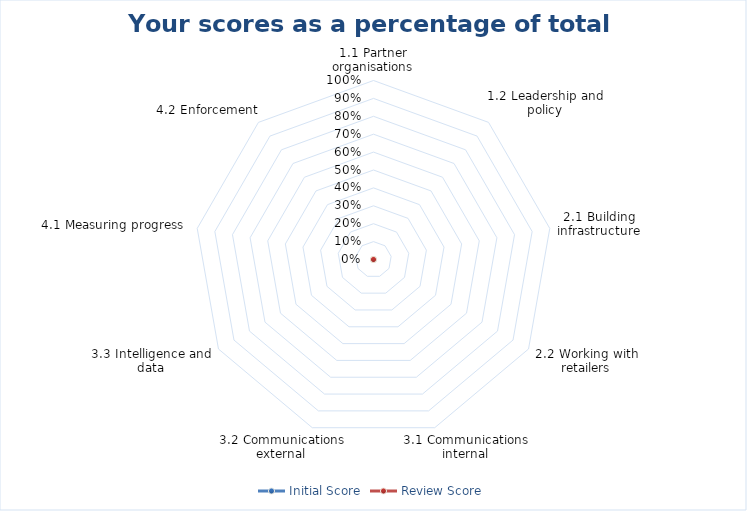
| Category | Initial Score | Review Score |
|---|---|---|
| 1.1 Partner organisations | 0 | 0 |
| 1.2 Leadership and policy | 0 | 0 |
| 2.1 Building infrastructure | 0 | 0 |
| 2.2 Working with retailers | 0 | 0 |
| 3.1 Communications internal | 0 | 0 |
| 3.2 Communications external | 0 | 0 |
| 3.3 Intelligence and data | 0 | 0 |
| 4.1 Measuring progress  | 0 | 0 |
| 4.2 Enforcement | 0 | 0 |